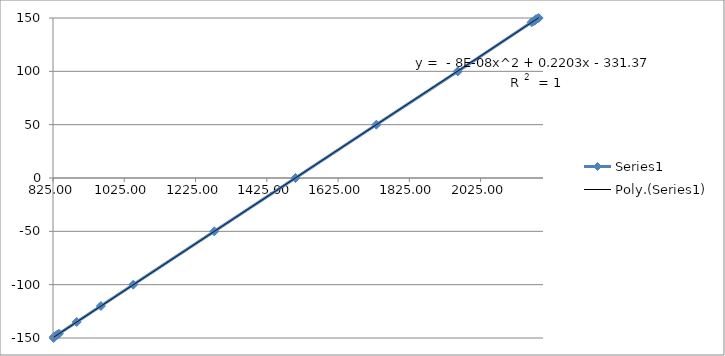
| Category | Series 0 |
|---|---|
| 2187.852 | 150 |
| 2180.732 | 149 |
| 2178.54 | 148 |
| 2173.86 | 147 |
| 2167.92 | 146 |
| 1961.008 | 100 |
| 1732.348 | 50 |
| 1505.4053333333334 | 0 |
| 1277.648 | -50 |
| 1050.22 | -100 |
| 959.432 | -120 |
| 891.516 | -135 |
| 841.548 | -146 |
| 836.76 | -147 |
| 832.016 | -148 |
| 827.468 | -149 |
| 826.796 | -150 |